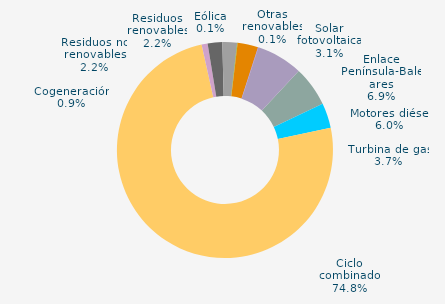
| Category | Series 0 |
|---|---|
| Carbón | 0 |
| Motores diésel | 6.018 |
| Turbina de gas | 3.749 |
| Ciclo combinado | 74.809 |
| Generación auxiliar | 0 |
| Cogeneración | 0.903 |
| Residuos no renovables | 2.184 |
| Residuos renovables | 2.184 |
| Eólica | 0.076 |
| Solar fotovoltaica | 3.075 |
| Otras renovables | 0.066 |
| Enlace Península-Baleares | 6.936 |